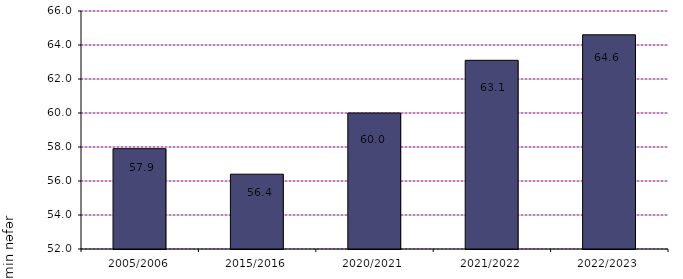
| Category | min nцfцr |
|---|---|
| 2005/2006 | 57.9 |
| 2015/2016 | 56.4 |
| 2020/2021 | 60 |
| 2021/2022 | 63.1 |
| 2022/2023 | 64.6 |